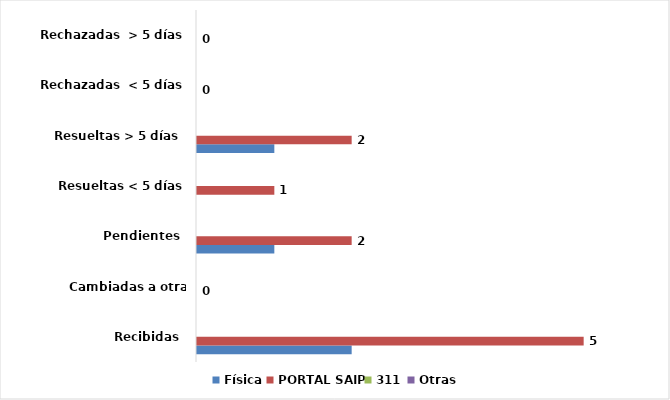
| Category | Física | PORTAL SAIP | 311 | Otras |
|---|---|---|---|---|
| Recibidas  | 2 | 5 | 0 | 0 |
| Cambiadas a otra institución | 0 | 0 | 0 | 0 |
| Pendientes  | 1 | 2 | 0 | 0 |
| Resueltas < 5 días | 0 | 1 | 0 | 0 |
| Resueltas > 5 días  | 1 | 2 | 0 | 0 |
| Rechazadas  < 5 días | 0 | 0 | 0 | 0 |
| Rechazadas  > 5 días | 0 | 0 | 0 | 0 |